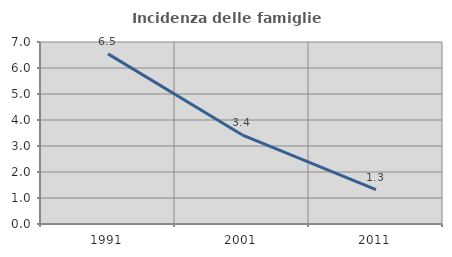
| Category | Incidenza delle famiglie numerose |
|---|---|
| 1991.0 | 6.542 |
| 2001.0 | 3.431 |
| 2011.0 | 1.322 |